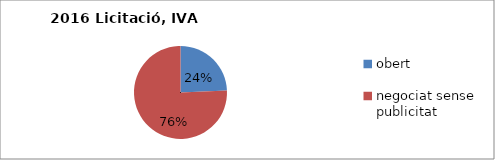
| Category | Licitació, IVA exclòs |
|---|---|
| obert | 1601961 |
| negociat sense publicitat  | 4997764.67 |